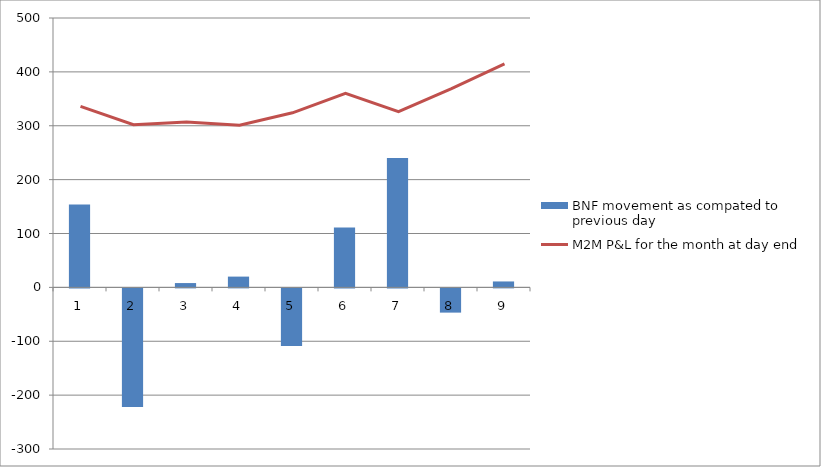
| Category | BNF movement as compated to previous day  |
|---|---|
| 0 | 154 |
| 1 | -220 |
| 2 | 8 |
| 3 | 20 |
| 4 | -107 |
| 5 | 111 |
| 6 | 240 |
| 7 | -45 |
| 8 | 11 |